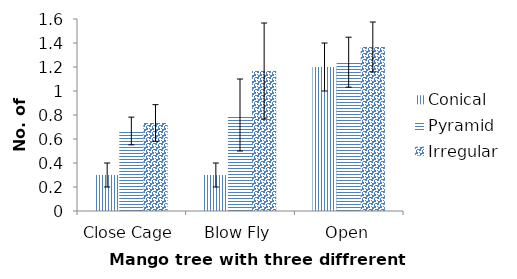
| Category | Conical | Pyramid | Irregular |
|---|---|---|---|
| Close Cage | 0.3 | 0.667 | 0.733 |
| Blow Fly | 0.3 | 0.8 | 1.167 |
| Open | 1.2 | 1.24 | 1.367 |